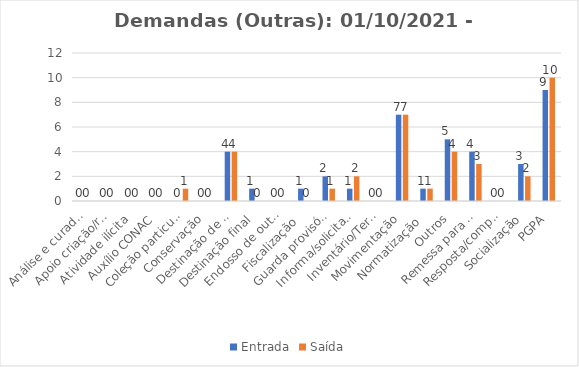
| Category | Entrada | Saída |
|---|---|---|
| Análise e curadoria | 0 | 0 |
| Apoio criação/revitalização IGP | 0 | 0 |
| Atividade ilícita | 0 | 0 |
| Auxílio CONAC | 0 | 0 |
| Coleção particular | 0 | 1 |
| Conservação | 0 | 0 |
| Destinação de TAC | 4 | 4 |
| Destinação final | 1 | 0 |
| Endosso de outra UF | 0 | 0 |
| Fiscalização  | 1 | 0 |
| Guarda provisória | 2 | 1 |
| Informa/solicita ao Iphan | 1 | 2 |
| Inventário/Termo de recebimento | 0 | 0 |
| Movimentação | 7 | 7 |
| Normatização  | 1 | 1 |
| Outros | 5 | 4 |
| Remessa para o exterior | 4 | 3 |
| Resposta/complementação | 0 | 0 |
| Socialização | 3 | 2 |
| PGPA | 9 | 10 |